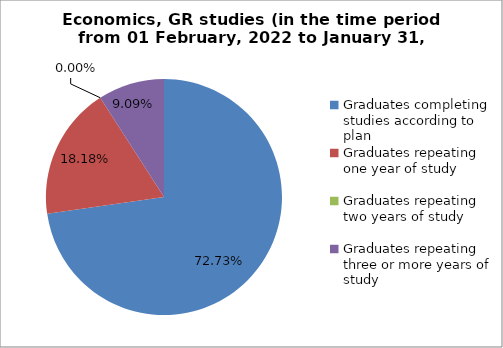
| Category | Series 0 |
|---|---|
| Graduates completing studies according to plan | 72.727 |
| Graduates repeating one year of study | 18.182 |
| Graduates repeating two years of study | 0 |
| Graduates repeating three or more years of study | 9.091 |